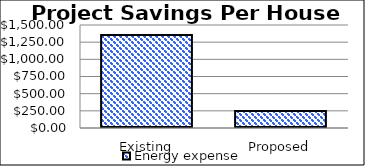
| Category | Energy expense |
|---|---|
| Existing | 1355.112 |
| Proposed | 246.383 |